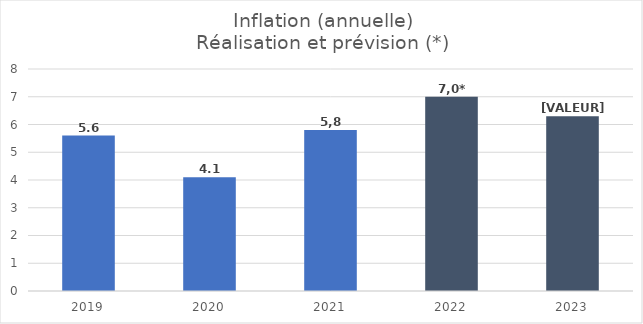
| Category |  Inflation  |
|---|---|
| 2019.0 | 5.6 |
| 2020.0 | 4.1 |
| 2021.0 | 5.8 |
| 2022.0 | 7 |
| 2023.0 | 6.3 |